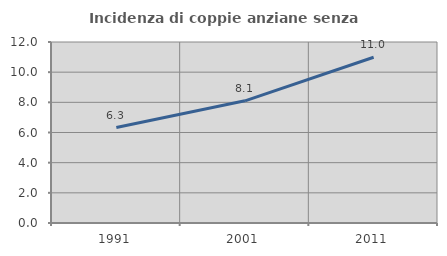
| Category | Incidenza di coppie anziane senza figli  |
|---|---|
| 1991.0 | 6.328 |
| 2001.0 | 8.099 |
| 2011.0 | 10.992 |